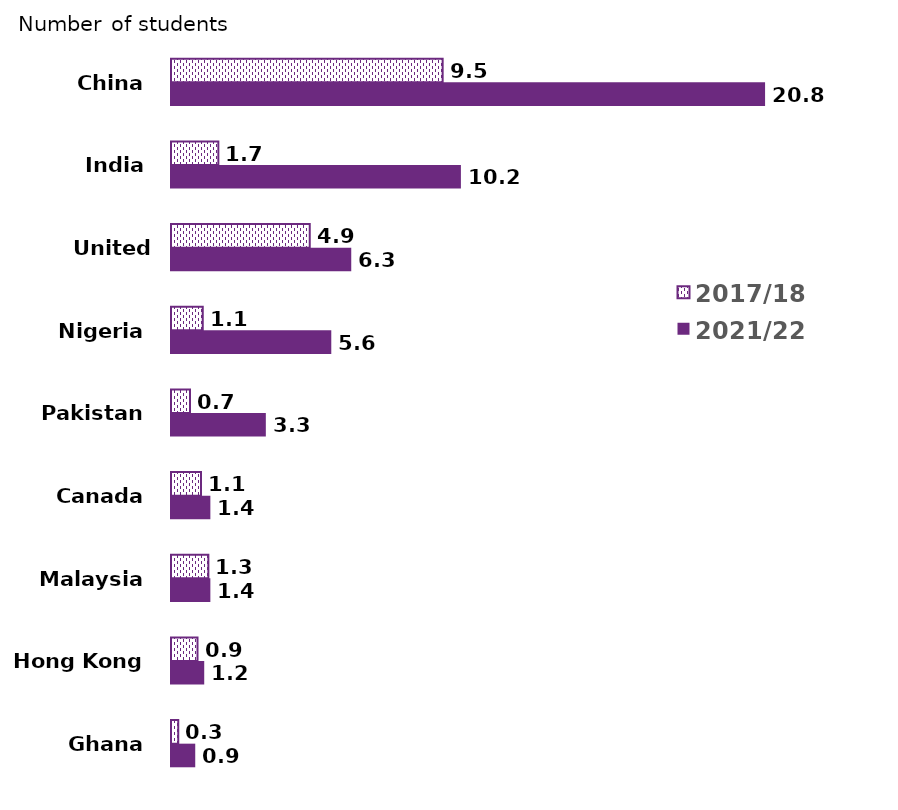
| Category | 2017/18 | 2021/22 |
|---|---|---|
| China | 9525 | 20830 |
| India | 1660 | 10165 |
| United States | 4865 | 6320 |
| Nigeria | 1115 | 5620 |
| Pakistan | 665 | 3325 |
| Canada | 1050 | 1380 |
| Malaysia | 1310 | 1380 |
| Hong Kong | 930 | 1165 |
| Ghana | 250 | 850 |